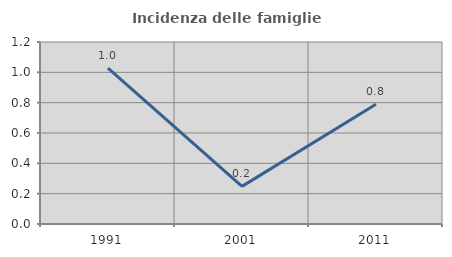
| Category | Incidenza delle famiglie numerose |
|---|---|
| 1991.0 | 1.028 |
| 2001.0 | 0.248 |
| 2011.0 | 0.789 |